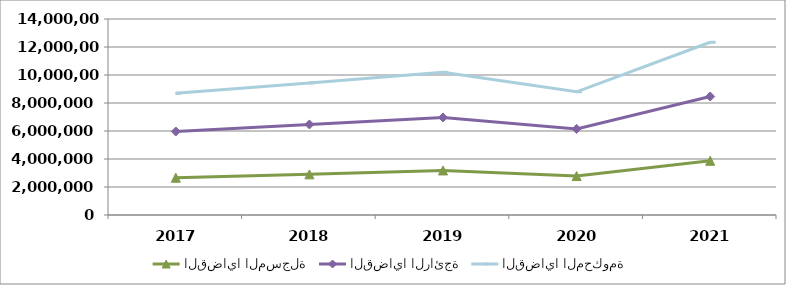
| Category | القضايا المسجلة | القضايا الرائجة | القضايا المحكومة |
|---|---|---|---|
| 2017.0 | 2663038 | 3301775 | 2728534 |
| 2018.0 | 2902443 | 3566757 | 2967047 |
| 2019.0 | 3182606 | 3785058 | 3221143 |
| 2020.0 | 2782048 | 3368901 | 2649452 |
| 2021.0 | 3873640 | 4590276 | 3875011 |